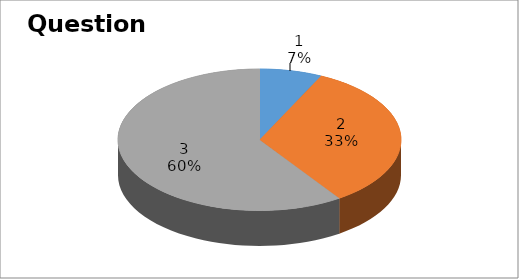
| Category | Series 0 |
|---|---|
| 0 | 3 |
| 1 | 14 |
| 2 | 25 |